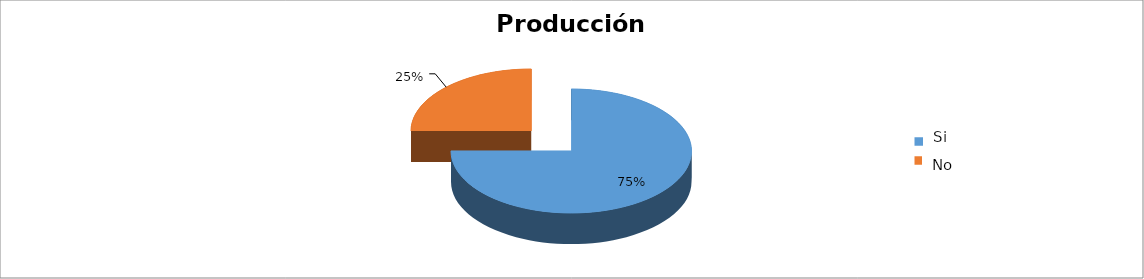
| Category | Series 0 |
|---|---|
| 0 | 0.75 |
| 1 | 0.25 |